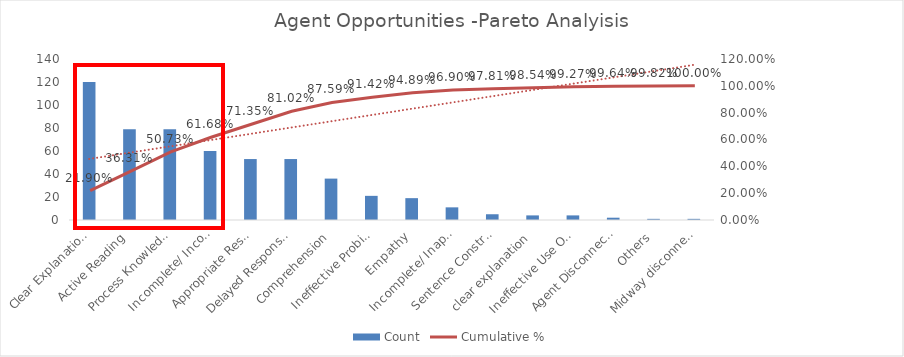
| Category | Count |
|---|---|
| Clear Explanations | 120 |
| Active Reading | 79 |
| Process Knowledge Gap | 79 |
| Incomplete/ Incorrect Resolution | 60 |
| Appropriate Responses | 53 |
| Delayed Responses | 53 |
| Comprehension | 36 |
| Ineffective Probing | 21 |
| Empathy | 19 |
| Incomplete/ Inappropriate Resolution | 11 |
| Sentence Construction | 5 |
| clear explanation  | 4 |
| Ineffective Use Of Scripts | 4 |
| Agent Disconnected Chat | 2 |
| Others | 1 |
| Midway disconnect | 1 |